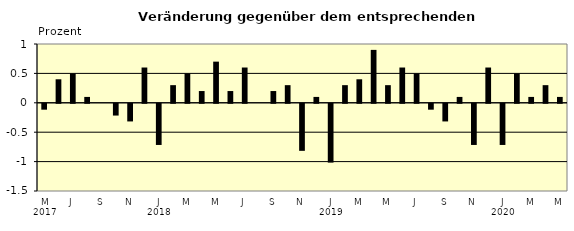
| Category | Series 0 |
|---|---|
| 0 | -0.1 |
| 1 | 0.4 |
| 2 | 0.5 |
| 3 | 0.1 |
| 4 | 0 |
| 5 | -0.2 |
| 6 | -0.3 |
| 7 | 0.6 |
| 8 | -0.7 |
| 9 | 0.3 |
| 10 | 0.5 |
| 11 | 0.2 |
| 12 | 0.7 |
| 13 | 0.2 |
| 14 | 0.6 |
| 15 | 0 |
| 16 | 0.2 |
| 17 | 0.3 |
| 18 | -0.8 |
| 19 | 0.1 |
| 20 | -1 |
| 21 | 0.3 |
| 22 | 0.4 |
| 23 | 0.9 |
| 24 | 0.3 |
| 25 | 0.6 |
| 26 | 0.5 |
| 27 | -0.1 |
| 28 | -0.3 |
| 29 | 0.1 |
| 30 | -0.7 |
| 31 | 0.6 |
| 32 | -0.7 |
| 33 | 0.5 |
| 34 | 0.1 |
| 35 | 0.3 |
| 36 | 0.1 |